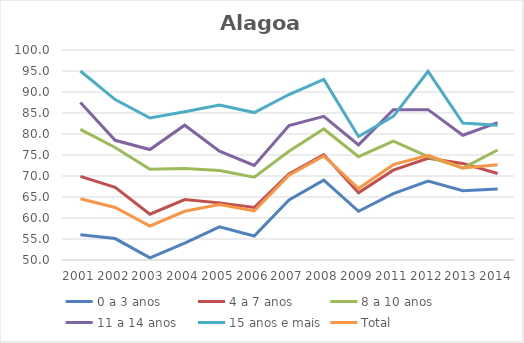
| Category | 0 a 3 anos | 4 a 7 anos | 8 a 10 anos | 11 a 14 anos | 15 anos e mais | Total |
|---|---|---|---|---|---|---|
| 2001.0 | 56 | 69.9 | 81.1 | 87.5 | 95 | 64.6 |
| 2002.0 | 55.1 | 67.3 | 76.8 | 78.5 | 88.2 | 62.5 |
| 2003.0 | 50.5 | 60.9 | 71.6 | 76.3 | 83.8 | 58.1 |
| 2004.0 | 54 | 64.4 | 71.8 | 82.1 | 85.3 | 61.6 |
| 2005.0 | 57.9 | 63.6 | 71.3 | 75.9 | 86.9 | 63.2 |
| 2006.0 | 55.7 | 62.5 | 69.7 | 72.5 | 85.1 | 61.7 |
| 2007.0 | 64.3 | 70.5 | 75.9 | 82 | 89.4 | 70.2 |
| 2008.0 | 69 | 75.1 | 81.2 | 84.2 | 93 | 74.8 |
| 2009.0 | 61.6 | 66 | 74.6 | 77.4 | 79.4 | 67 |
| 2011.0 | 65.8 | 71.4 | 78.3 | 85.8 | 84.2 | 72.7 |
| 2012.0 | 68.8 | 74.2 | 74.6 | 85.8 | 94.9 | 74.9 |
| 2013.0 | 66.5 | 73 | 71.9 | 79.7 | 82.6 | 71.9 |
| 2014.0 | 66.9 | 70.6 | 76.2 | 82.7 | 82.1 | 72.7 |